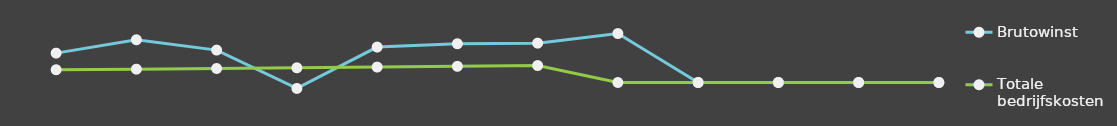
| Category | Brutowinst | Totale bedrijfskosten |
|---|---|---|
| 0 | 25000 | 10841 |
| 1 | 36348 | 11367.25 |
| 2 | 27562 | 11919.82 |
| 3 | -5059.5 | 12500.01 |
| 4 | 30153.18 | 13109.21 |
| 5 | 32964.45 | 13748.86 |
| 6 | 33502.87 | 14420.51 |
| 7 | 41646 | 0 |
| 8 | 0 | 0 |
| 9 | 0 | 0 |
| 10 | 0 | 0 |
| 11 | 0 | 0 |